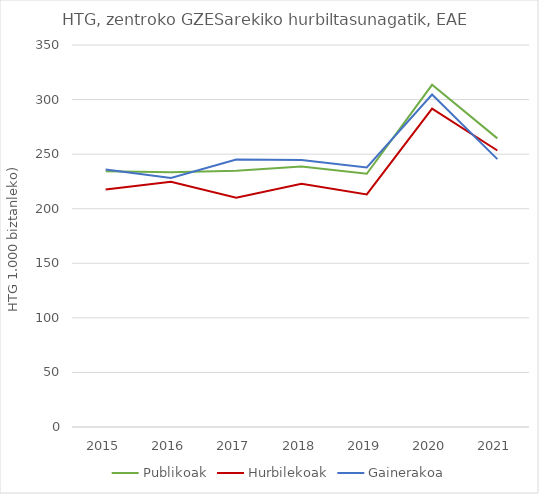
| Category | Publikoak | Hurbilekoak | Gainerakoa |
|---|---|---|---|
| 2015.0 | 234.312 | 217.661 | 235.83 |
| 2016.0 | 233.314 | 224.611 | 228.18 |
| 2017.0 | 234.767 | 209.996 | 245.011 |
| 2018.0 | 238.679 | 222.771 | 244.739 |
| 2019.0 | 231.993 | 213.106 | 237.818 |
| 2020.0 | 313.548 | 291.75 | 304.648 |
| 2021.0 | 264.444 | 253.336 | 245.467 |